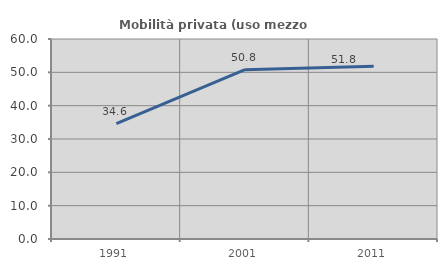
| Category | Mobilità privata (uso mezzo privato) |
|---|---|
| 1991.0 | 34.615 |
| 2001.0 | 50.801 |
| 2011.0 | 51.822 |